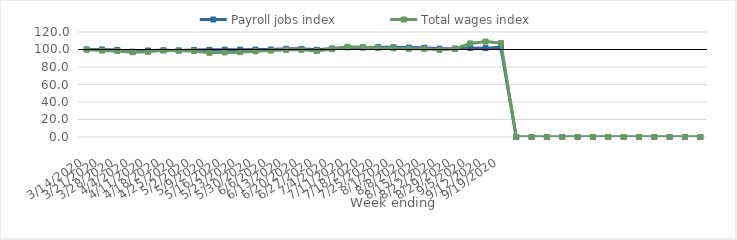
| Category | Payroll jobs index | Total wages index |
|---|---|---|
| 14/03/2020 | 100 | 100 |
| 21/03/2020 | 100.042 | 98.801 |
| 28/03/2020 | 99.533 | 98.38 |
| 04/04/2020 | 97.532 | 96.893 |
| 11/04/2020 | 98.865 | 97.312 |
| 18/04/2020 | 99.123 | 99.001 |
| 25/04/2020 | 98.982 | 98.564 |
| 02/05/2020 | 99.397 | 98.316 |
| 09/05/2020 | 99.586 | 96.333 |
| 16/05/2020 | 99.778 | 96.69 |
| 23/05/2020 | 99.843 | 96.964 |
| 30/05/2020 | 99.886 | 97.981 |
| 06/06/2020 | 100.051 | 98.785 |
| 13/06/2020 | 100.756 | 99.663 |
| 20/06/2020 | 100.748 | 99.667 |
| 27/06/2020 | 99.616 | 98.234 |
| 04/07/2020 | 101.21 | 100.483 |
| 11/07/2020 | 102.419 | 103.03 |
| 18/07/2020 | 102.298 | 102.574 |
| 25/07/2020 | 102.607 | 101.636 |
| 01/08/2020 | 102.486 | 101.327 |
| 08/08/2020 | 102.158 | 100.761 |
| 15/08/2020 | 102 | 100.736 |
| 22/08/2020 | 100.998 | 99.581 |
| 29/08/2020 | 101.025 | 100.758 |
| 05/09/2020 | 101.787 | 106.985 |
| 12/09/2020 | 101.562 | 109.068 |
| 19/09/2020 | 102.431 | 107.352 |